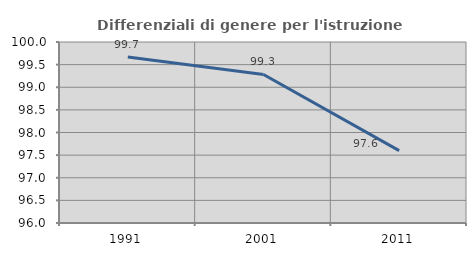
| Category | Differenziali di genere per l'istruzione superiore |
|---|---|
| 1991.0 | 99.668 |
| 2001.0 | 99.283 |
| 2011.0 | 97.599 |